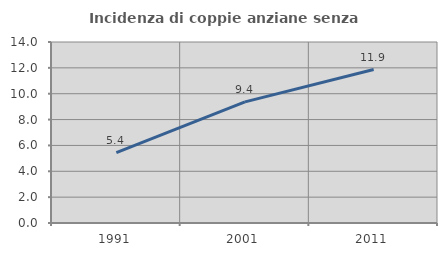
| Category | Incidenza di coppie anziane senza figli  |
|---|---|
| 1991.0 | 5.448 |
| 2001.0 | 9.368 |
| 2011.0 | 11.871 |